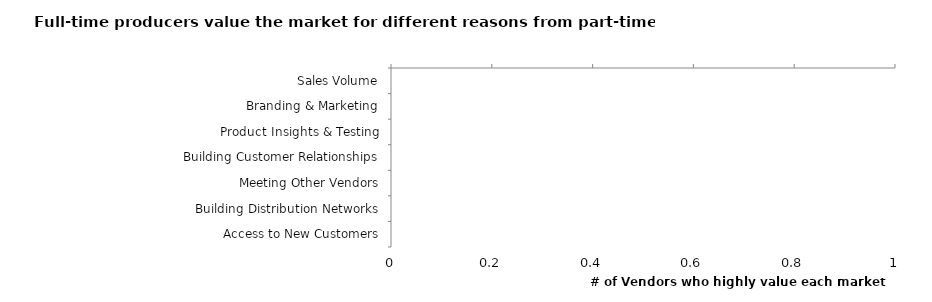
| Category | 1-5% | 5-25% | 25-50% | 50-75% | 75-95% | 95-100% |
|---|---|---|---|---|---|---|
| Sales Volume | 0 | 0 | 0 | 0 | 0 | 0 |
| Branding & Marketing | 0 | 0 | 0 | 0 | 0 | 0 |
| Product Insights & Testing | 0 | 0 | 0 | 0 | 0 | 0 |
| Building Customer Relationships | 0 | 0 | 0 | 0 | 0 | 0 |
| Meeting Other Vendors | 0 | 0 | 0 | 0 | 0 | 0 |
| Building Distribution Networks | 0 | 0 | 0 | 0 | 0 | 0 |
| Access to New Customers | 0 | 0 | 0 | 0 | 0 | 0 |